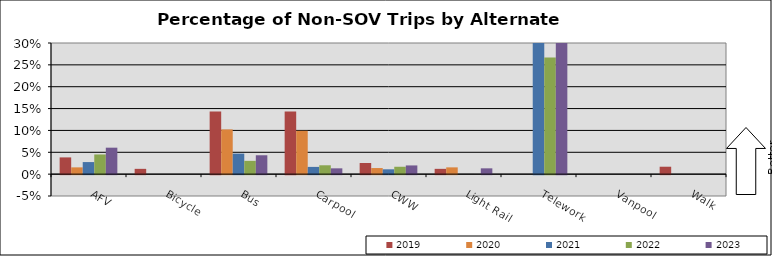
| Category | 2019 | 2020 | 2021 | 2022 | 2023 |
|---|---|---|---|---|---|
| AFV | 0.038 | 0.016 | 0.028 | 0.045 | 0.061 |
| Bicycle | 0.012 | 0 | 0 | 0 | 0 |
| Bus | 0.143 | 0.102 | 0.047 | 0.03 | 0.043 |
| Carpool | 0.143 | 0.099 | 0.017 | 0.02 | 0.013 |
| CWW | 0.025 | 0.014 | 0.011 | 0.017 | 0.02 |
| Light Rail | 0.012 | 0.016 | 0 | 0 | 0.013 |
| Telework | 0 | 0 | 0.304 | 0.267 | 0.302 |
| Vanpool | 0 | 0 | 0 | 0 | 0 |
| Walk | 0.017 | 0 | 0 | 0 | 0 |